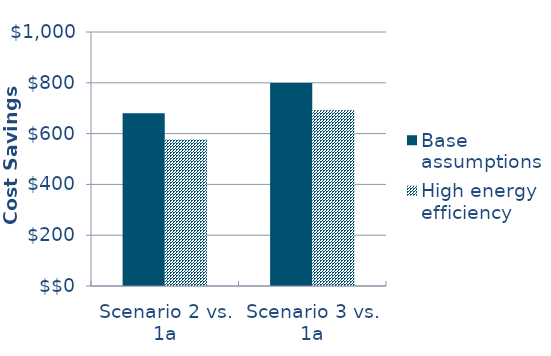
| Category | Base assumptions  | High energy efficiency |
|---|---|---|
| Scenario 2 vs. 1a | -679.806 | -576.399 |
| Scenario 3 vs. 1a | -799.049 | -692.056 |